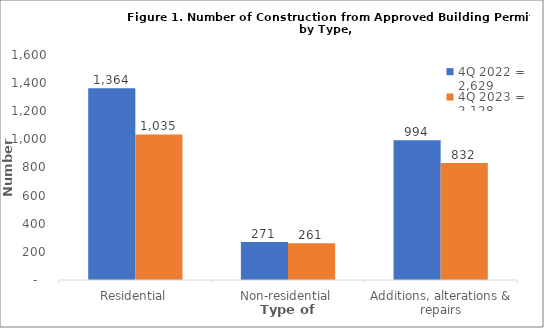
| Category |  4Q 2022 = 2,629  | 4Q 2023 = 2,128 |
|---|---|---|
| Residential | 1364 | 1035 |
| Non-residential | 271 | 261 |
| Additions, alterations & repairs | 994 | 832 |